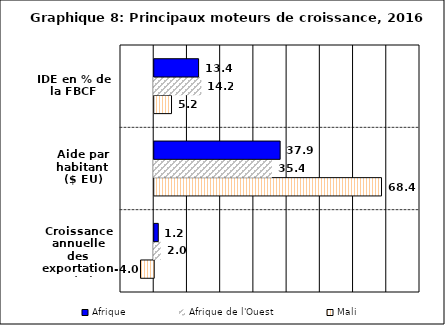
| Category | Mali | Afrique de l'Ouest | Afrique |
|---|---|---|---|
| Croissance annuelle des exportations (%) | -3.98 | 1.951 | 1.219 |
| Aide par habitant ($ EU) | 68.418 | 35.416 | 37.904 |
| IDE en % de la FBCF | 5.209 | 14.214 | 13.354 |